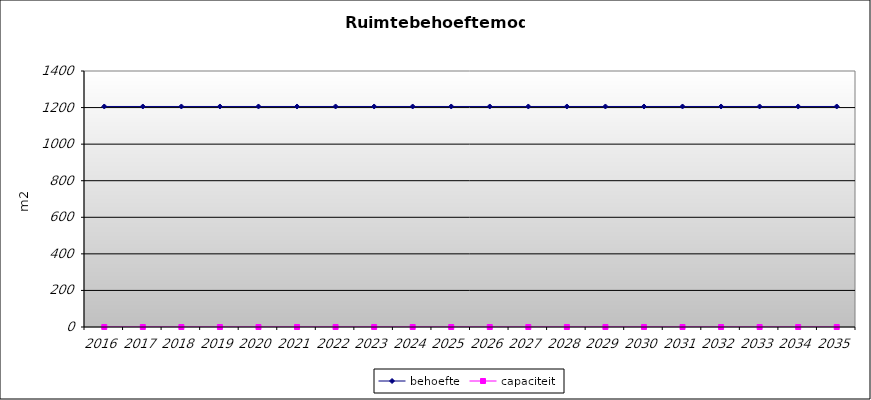
| Category | behoefte | capaciteit |
|---|---|---|
| 2016.0 | 1206 | 0 |
| 2017.0 | 1206 | 0 |
| 2018.0 | 1206 | 0 |
| 2019.0 | 1206 | 0 |
| 2020.0 | 1206 | 0 |
| 2021.0 | 1206 | 0 |
| 2022.0 | 1206 | 0 |
| 2023.0 | 1206 | 0 |
| 2024.0 | 1206 | 0 |
| 2025.0 | 1206 | 0 |
| 2026.0 | 1206 | 0 |
| 2027.0 | 1206 | 0 |
| 2028.0 | 1206 | 0 |
| 2029.0 | 1206 | 0 |
| 2030.0 | 1206 | 0 |
| 2031.0 | 1206 | 0 |
| 2032.0 | 1206 | 0 |
| 2033.0 | 1206 | 0 |
| 2034.0 | 1206 | 0 |
| 2035.0 | 1206 | 0 |